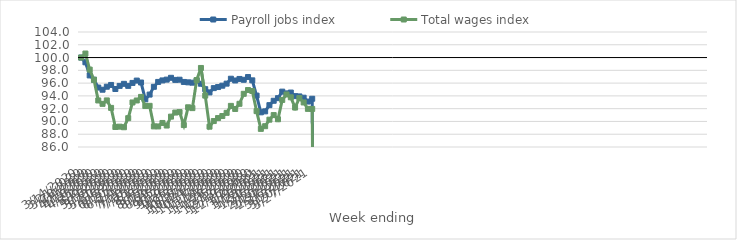
| Category | Payroll jobs index | Total wages index |
|---|---|---|
| 14/03/2020 | 100 | 100 |
| 21/03/2020 | 99.259 | 100.628 |
| 28/03/2020 | 97.203 | 98.116 |
| 04/04/2020 | 96.528 | 96.52 |
| 11/04/2020 | 95.305 | 93.285 |
| 18/04/2020 | 94.966 | 92.754 |
| 25/04/2020 | 95.435 | 93.291 |
| 02/05/2020 | 95.714 | 92.122 |
| 09/05/2020 | 95.077 | 89.135 |
| 16/05/2020 | 95.564 | 89.183 |
| 23/05/2020 | 95.886 | 89.092 |
| 30/05/2020 | 95.569 | 90.512 |
| 06/06/2020 | 96.029 | 92.97 |
| 13/06/2020 | 96.396 | 93.281 |
| 20/06/2020 | 96.092 | 93.84 |
| 27/06/2020 | 93.455 | 92.411 |
| 04/07/2020 | 94.203 | 92.444 |
| 11/07/2020 | 95.419 | 89.225 |
| 18/07/2020 | 96.184 | 89.22 |
| 25/07/2020 | 96.42 | 89.763 |
| 01/08/2020 | 96.546 | 89.36 |
| 08/08/2020 | 96.83 | 90.753 |
| 15/08/2020 | 96.503 | 91.391 |
| 22/08/2020 | 96.533 | 91.464 |
| 29/08/2020 | 96.182 | 89.435 |
| 05/09/2020 | 96.118 | 92.216 |
| 12/09/2020 | 96.068 | 92.087 |
| 19/09/2020 | 96.398 | 96.485 |
| 26/09/2020 | 95.902 | 98.372 |
| 03/10/2020 | 95.051 | 94.042 |
| 10/10/2020 | 94.543 | 89.184 |
| 17/10/2020 | 95.217 | 90.061 |
| 24/10/2020 | 95.385 | 90.529 |
| 31/10/2020 | 95.595 | 90.849 |
| 07/11/2020 | 95.917 | 91.344 |
| 14/11/2020 | 96.685 | 92.439 |
| 21/11/2020 | 96.409 | 91.953 |
| 28/11/2020 | 96.652 | 92.76 |
| 05/12/2020 | 96.52 | 94.326 |
| 12/12/2020 | 96.949 | 94.915 |
| 19/12/2020 | 96.431 | 94.767 |
| 26/12/2020 | 94.042 | 91.616 |
| 02/01/2021 | 91.425 | 88.837 |
| 09/01/2021 | 91.579 | 89.255 |
| 16/01/2021 | 92.552 | 90.276 |
| 23/01/2021 | 93.235 | 90.995 |
| 30/01/2021 | 93.644 | 90.34 |
| 06/02/2021 | 94.665 | 93.368 |
| 13/02/2021 | 94.389 | 94.22 |
| 20/02/2021 | 94.522 | 93.779 |
| 27/02/2021 | 93.964 | 92.174 |
| 06/03/2021 | 93.918 | 93.651 |
| 13/03/2021 | 93.714 | 92.972 |
| 20/03/2021 | 93.113 | 91.966 |
| 27/03/2021 | 93.552 | 91.96 |